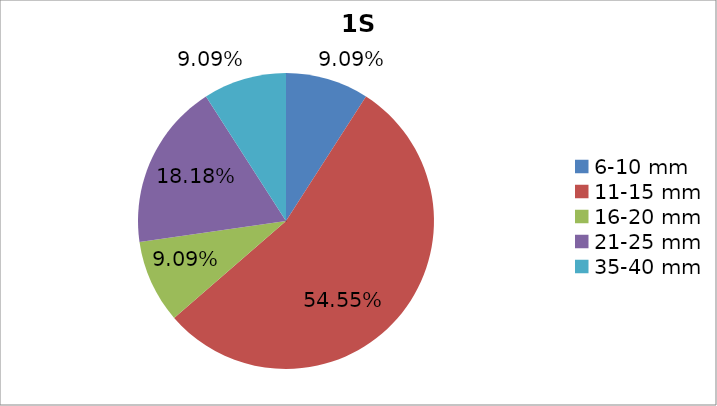
| Category | Series 0 |
|---|---|
| 6-10 mm | 0.091 |
| 11-15 mm | 0.546 |
| 16-20 mm | 0.091 |
| 21-25 mm | 0.182 |
| 35-40 mm | 0.091 |